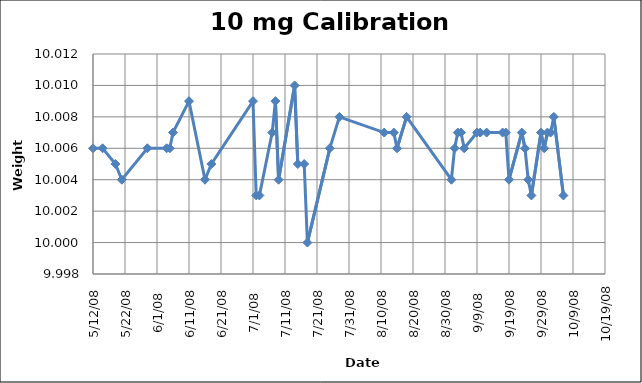
| Category | Series 0 |
|---|---|
| 39580.0 | 10.006 |
| 39583.0 | 10.006 |
| 39587.0 | 10.005 |
| 39589.0 | 10.004 |
| 39597.0 | 10.006 |
| 39603.0 | 10.006 |
| 39604.0 | 10.006 |
| 39605.0 | 10.007 |
| 39610.0 | 10.009 |
| 39615.0 | 10.004 |
| 39617.0 | 10.005 |
| 39630.0 | 10.009 |
| 39631.0 | 10.003 |
| 39632.0 | 10.003 |
| 39636.0 | 10.007 |
| 39637.0 | 10.009 |
| 39638.0 | 10.004 |
| 39643.0 | 10.01 |
| 39644.0 | 10.005 |
| 39646.0 | 10.005 |
| 39647.0 | 10 |
| 39654.0 | 10.006 |
| 39657.0 | 10.008 |
| 39671.0 | 10.007 |
| 39674.0 | 10.007 |
| 39675.0 | 10.006 |
| 39678.0 | 10.008 |
| 39692.0 | 10.004 |
| 39693.0 | 10.006 |
| 39694.0 | 10.007 |
| 39695.0 | 10.007 |
| 39696.0 | 10.006 |
| 39700.0 | 10.007 |
| 39701.0 | 10.007 |
| 39703.0 | 10.007 |
| 39708.0 | 10.007 |
| 39709.0 | 10.007 |
| 39710.0 | 10.004 |
| 39714.0 | 10.007 |
| 39715.0 | 10.006 |
| 39716.0 | 10.004 |
| 39717.0 | 10.003 |
| 39720.0 | 10.007 |
| 39721.0 | 10.006 |
| 39722.0 | 10.007 |
| 39723.0 | 10.007 |
| 39724.0 | 10.008 |
| 39727.0 | 10.003 |